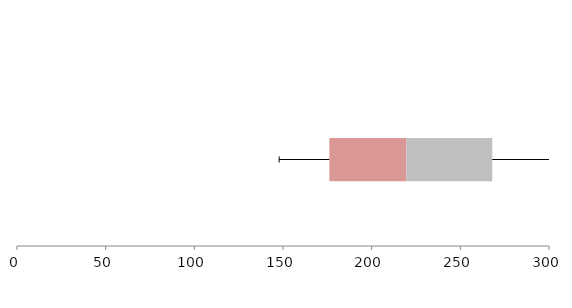
| Category | Series 1 | Series 2 | Series 3 |
|---|---|---|---|
| 0 | 176.145 | 43.45 | 48.405 |